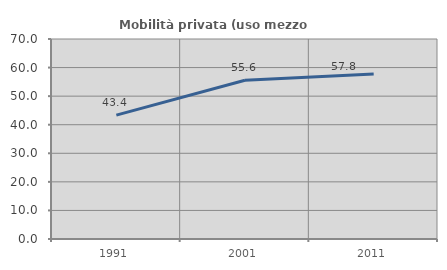
| Category | Mobilità privata (uso mezzo privato) |
|---|---|
| 1991.0 | 43.363 |
| 2001.0 | 55.553 |
| 2011.0 | 57.766 |